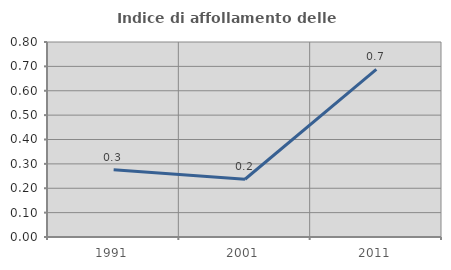
| Category | Indice di affollamento delle abitazioni  |
|---|---|
| 1991.0 | 0.275 |
| 2001.0 | 0.237 |
| 2011.0 | 0.688 |